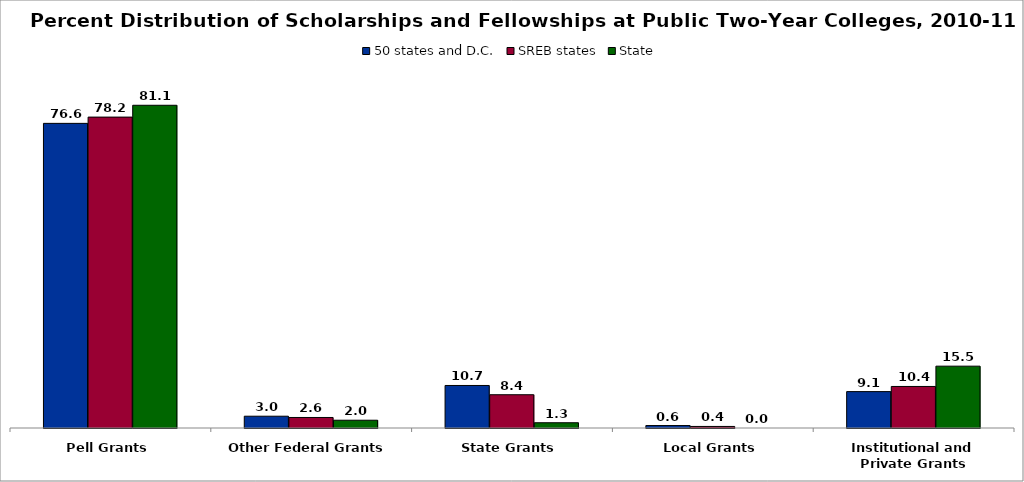
| Category | 50 states and D.C. | SREB states | State |
|---|---|---|---|
| Pell Grants | 76.583 | 78.157 | 81.134 |
| Other Federal Grants | 2.963 | 2.644 | 1.954 |
| State Grants | 10.69 | 8.366 | 1.322 |
| Local Grants | 0.617 | 0.389 | 0 |
| Institutional and Private Grants | 9.148 | 10.444 | 15.546 |